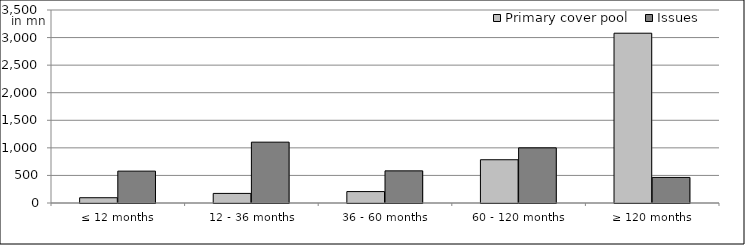
| Category | Primary cover pool | Issues |
|---|---|---|
| ≤ 12 months | 95611397.38 | 578000000 |
| 12 - 36 months | 173737610.24 | 1103378446.27 |
| 36 - 60 months | 206863640.095 | 582650000 |
| 60 - 120 months | 784590193.63 | 1000000000 |
| ≥ 120 months | 3079050323.947 | 463733665.9 |